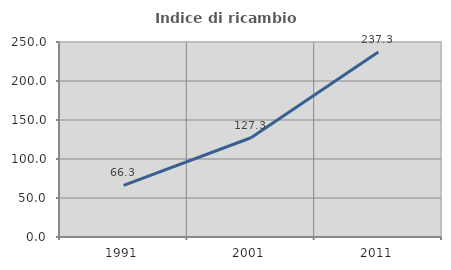
| Category | Indice di ricambio occupazionale  |
|---|---|
| 1991.0 | 66.304 |
| 2001.0 | 127.273 |
| 2011.0 | 237.255 |